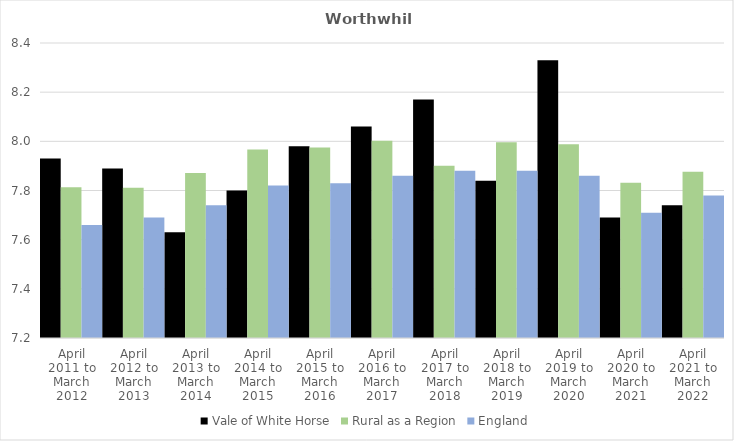
| Category | Vale of White Horse | Rural as a Region | England |
|---|---|---|---|
| April 2011 to March 2012 | 7.93 | 7.813 | 7.66 |
| April 2012 to March 2013 | 7.89 | 7.811 | 7.69 |
| April 2013 to March 2014 | 7.63 | 7.871 | 7.74 |
| April 2014 to March 2015 | 7.8 | 7.967 | 7.82 |
| April 2015 to March 2016 | 7.98 | 7.975 | 7.83 |
| April 2016 to March 2017 | 8.06 | 8.002 | 7.86 |
| April 2017 to March 2018 | 8.17 | 7.9 | 7.88 |
| April 2018 to March 2019 | 7.84 | 7.996 | 7.88 |
| April 2019 to March 2020 | 8.33 | 7.988 | 7.86 |
| April 2020 to March 2021 | 7.69 | 7.831 | 7.71 |
| April 2021 to March 2022 | 7.74 | 7.877 | 7.78 |